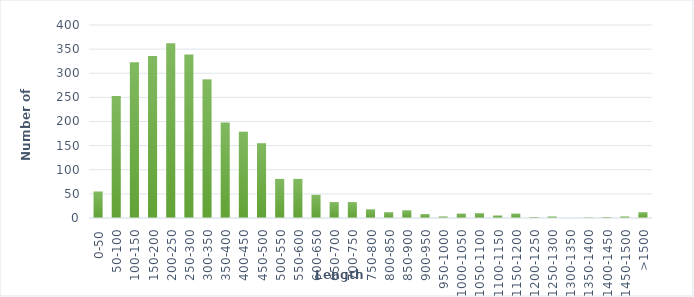
| Category | Number of Proteins |
|---|---|
| 0-50 | 55 |
| 50-100 | 253 |
| 100-150 | 323 |
| 150-200 | 336 |
| 200-250 | 362 |
| 250-300 | 339 |
| 300-350 | 287 |
| 350-400 | 198 |
| 400-450 | 179 |
| 450-500 | 155 |
| 500-550 | 81 |
| 550-600 | 81 |
| 600-650 | 48 |
| 650-700 | 33 |
| 700-750 | 33 |
| 750-800 | 18 |
| 800-850 | 12 |
| 850-900 | 16 |
| 900-950 | 8 |
| 950-1000 | 3 |
| 1000-1050 | 9 |
| 1050-1100 | 10 |
| 1100-1150 | 5 |
| 1150-1200 | 9 |
| 1200-1250 | 2 |
| 1250-1300 | 3 |
| 1300-1350 | 0 |
| 1350-1400 | 1 |
| 1400-1450 | 2 |
| 1450-1500 | 3 |
| >1500 | 12 |